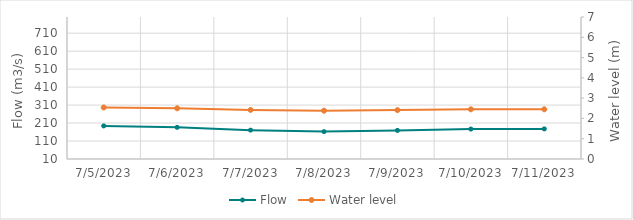
| Category | Flow |
|---|---|
| 5/11/23 | 460.97 |
| 5/10/23 | 454.54 |
| 5/9/23 | 470.5 |
| 5/8/23 | 406.35 |
| 5/7/23 | 363.18 |
| 5/6/23 | 265.45 |
| 5/5/23 | 240.06 |